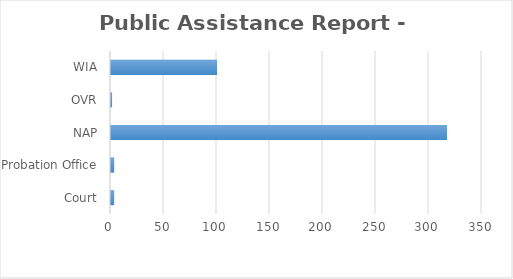
| Category | Series 0 |
|---|---|
| Court | 3 |
| Probation Office | 3 |
| NAP | 317 |
| OVR | 1 |
| WIA | 100 |